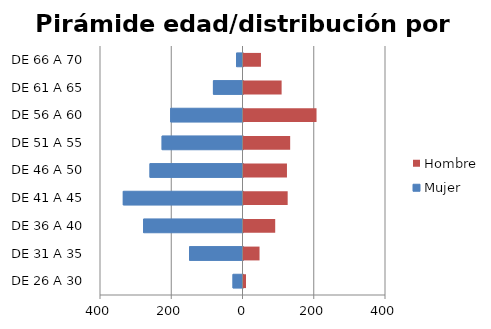
| Category | Mujer | Hombre |
|---|---|---|
| DE 26 A 30 | -28 | 7 |
| DE 31 A 35 | -150 | 45 |
| DE 36 A 40 | -279 | 89 |
| DE 41 A 45 | -336 | 124 |
| DE 46 A 50 | -261 | 122 |
| DE 51 A 55 | -227 | 131 |
| DE 56 A 60 | -203 | 205 |
| DE 61 A 65 | -83 | 107 |
| DE 66 A 70 | -18 | 49 |